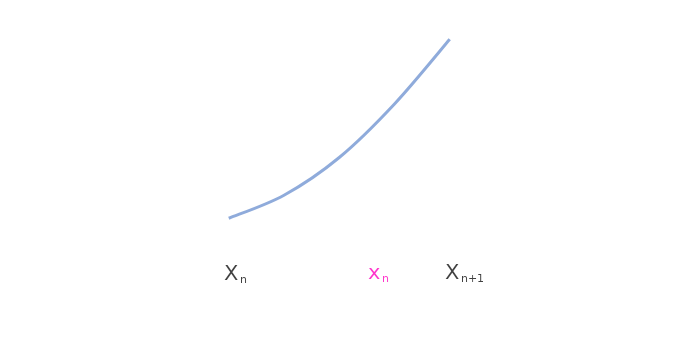
| Category | Series 0 |
|---|---|
| 0.3 | 0.087 |
| 0.4 | 0.18 |
| 0.5 | 0.332 |
| 0.6 | 0.547 |
| 0.7 | 0.807 |